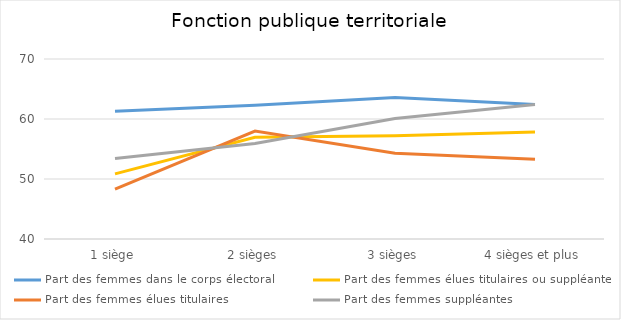
| Category | Part des femmes dans le corps électoral | Part des femmes élues titulaires ou suppléantes | Part des femmes élues titulaires | Part des femmes suppléantes |
|---|---|---|---|---|
| 1 siège | 61.3 | 50.85 | 48.3 | 53.4 |
| 2 sièges | 62.3 | 56.95 | 58 | 55.9 |
| 3 sièges | 63.6 | 57.2 | 54.3 | 60.1 |
| 4 sièges et plus | 62.4 | 57.85 | 53.3 | 62.4 |